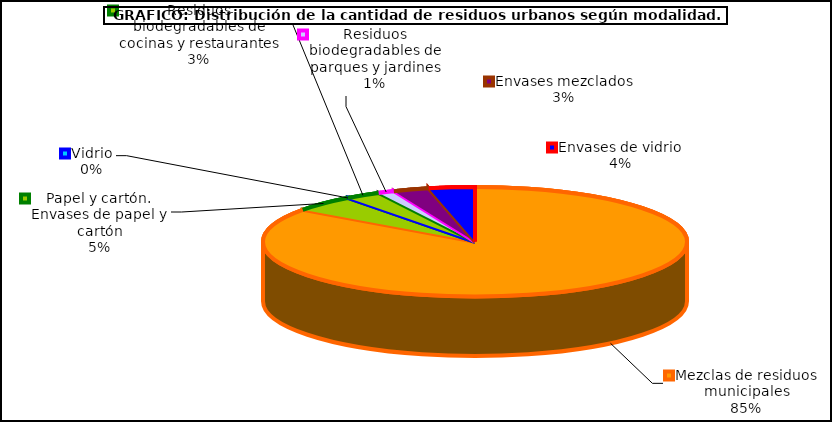
| Category | Total |
|---|---|
| Mezclas de residuos municipales | 84.909 |
| Papel y cartón. Envases de papel y cartón | 4.844 |
| Vidrio | 0.023 |
| Residuos biodegradables de cocinas y restaurantes | 2.716 |
| Residuos biodegradables de parques y jardines | 1.255 |
| Envases mezclados | 2.742 |
| Envases de vidrio | 3.511 |